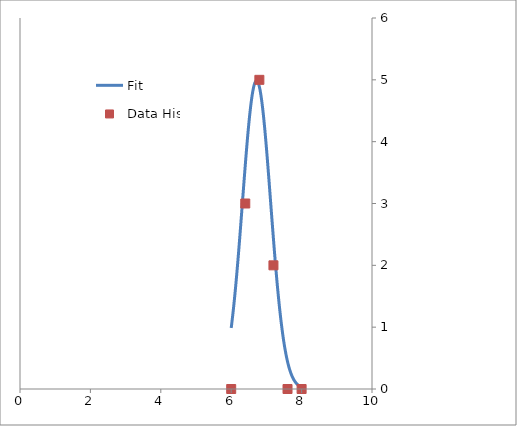
| Category | Fit |
|---|---|
| 6.0 | 0.197 |
| 6.01 | 0.206 |
| 6.02 | 0.216 |
| 6.029999999999999 | 0.225 |
| 6.039999999999999 | 0.235 |
| 6.049999999999999 | 0.245 |
| 6.059999999999999 | 0.256 |
| 6.0699999999999985 | 0.266 |
| 6.079999999999998 | 0.277 |
| 6.089999999999998 | 0.289 |
| 6.099999999999998 | 0.3 |
| 6.109999999999998 | 0.312 |
| 6.119999999999997 | 0.324 |
| 6.129999999999997 | 0.336 |
| 6.139999999999997 | 0.349 |
| 6.149999999999997 | 0.361 |
| 6.159999999999997 | 0.374 |
| 6.169999999999996 | 0.388 |
| 6.179999999999996 | 0.401 |
| 6.189999999999996 | 0.415 |
| 6.199999999999996 | 0.428 |
| 6.2099999999999955 | 0.442 |
| 6.219999999999995 | 0.457 |
| 6.229999999999995 | 0.471 |
| 6.239999999999995 | 0.485 |
| 6.249999999999995 | 0.5 |
| 6.2599999999999945 | 0.515 |
| 6.269999999999994 | 0.53 |
| 6.279999999999994 | 0.545 |
| 6.289999999999994 | 0.56 |
| 6.299999999999994 | 0.575 |
| 6.309999999999993 | 0.59 |
| 6.319999999999993 | 0.605 |
| 6.329999999999993 | 0.62 |
| 6.339999999999993 | 0.635 |
| 6.3499999999999925 | 0.65 |
| 6.359999999999992 | 0.665 |
| 6.369999999999992 | 0.68 |
| 6.379999999999992 | 0.695 |
| 6.389999999999992 | 0.71 |
| 6.3999999999999915 | 0.724 |
| 6.409999999999991 | 0.739 |
| 6.419999999999991 | 0.753 |
| 6.429999999999991 | 0.767 |
| 6.439999999999991 | 0.781 |
| 6.44999999999999 | 0.794 |
| 6.45999999999999 | 0.807 |
| 6.46999999999999 | 0.82 |
| 6.47999999999999 | 0.833 |
| 6.4899999999999896 | 0.845 |
| 6.499999999999989 | 0.857 |
| 6.509999999999989 | 0.869 |
| 6.519999999999989 | 0.88 |
| 6.529999999999989 | 0.891 |
| 6.5399999999999885 | 0.901 |
| 6.549999999999988 | 0.911 |
| 6.559999999999988 | 0.921 |
| 6.569999999999988 | 0.93 |
| 6.579999999999988 | 0.938 |
| 6.589999999999987 | 0.946 |
| 6.599999999999987 | 0.953 |
| 6.609999999999987 | 0.96 |
| 6.619999999999987 | 0.967 |
| 6.629999999999987 | 0.972 |
| 6.639999999999986 | 0.978 |
| 6.649999999999986 | 0.982 |
| 6.659999999999986 | 0.986 |
| 6.669999999999986 | 0.99 |
| 6.6799999999999855 | 0.992 |
| 6.689999999999985 | 0.995 |
| 6.699999999999985 | 0.996 |
| 6.709999999999985 | 0.997 |
| 6.719999999999985 | 0.997 |
| 6.729999999999984 | 0.997 |
| 6.739999999999984 | 0.996 |
| 6.749999999999984 | 0.995 |
| 6.759999999999984 | 0.992 |
| 6.769999999999984 | 0.99 |
| 6.779999999999983 | 0.986 |
| 6.789999999999983 | 0.982 |
| 6.799999999999983 | 0.978 |
| 6.809999999999983 | 0.972 |
| 6.8199999999999825 | 0.967 |
| 6.829999999999982 | 0.96 |
| 6.839999999999982 | 0.953 |
| 6.849999999999982 | 0.946 |
| 6.859999999999982 | 0.938 |
| 6.8699999999999815 | 0.93 |
| 6.879999999999981 | 0.921 |
| 6.889999999999981 | 0.911 |
| 6.899999999999981 | 0.901 |
| 6.909999999999981 | 0.891 |
| 6.91999999999998 | 0.88 |
| 6.92999999999998 | 0.869 |
| 6.93999999999998 | 0.857 |
| 6.94999999999998 | 0.845 |
| 6.9599999999999795 | 0.833 |
| 6.969999999999979 | 0.82 |
| 6.979999999999979 | 0.807 |
| 6.989999999999979 | 0.794 |
| 6.999999999999979 | 0.781 |
| 7.0099999999999785 | 0.767 |
| 7.019999999999978 | 0.753 |
| 7.029999999999978 | 0.739 |
| 7.039999999999978 | 0.724 |
| 7.049999999999978 | 0.71 |
| 7.059999999999977 | 0.695 |
| 7.069999999999977 | 0.68 |
| 7.079999999999977 | 0.665 |
| 7.089999999999977 | 0.65 |
| 7.0999999999999766 | 0.635 |
| 7.109999999999976 | 0.62 |
| 7.119999999999976 | 0.605 |
| 7.129999999999976 | 0.59 |
| 7.139999999999976 | 0.575 |
| 7.1499999999999755 | 0.56 |
| 7.159999999999975 | 0.545 |
| 7.169999999999975 | 0.53 |
| 7.179999999999975 | 0.515 |
| 7.189999999999975 | 0.5 |
| 7.199999999999974 | 0.485 |
| 7.209999999999974 | 0.471 |
| 7.219999999999974 | 0.457 |
| 7.229999999999974 | 0.442 |
| 7.239999999999974 | 0.428 |
| 7.249999999999973 | 0.415 |
| 7.259999999999973 | 0.401 |
| 7.269999999999973 | 0.388 |
| 7.279999999999973 | 0.374 |
| 7.2899999999999725 | 0.361 |
| 7.299999999999972 | 0.349 |
| 7.309999999999972 | 0.336 |
| 7.319999999999972 | 0.324 |
| 7.329999999999972 | 0.312 |
| 7.339999999999971 | 0.3 |
| 7.349999999999971 | 0.289 |
| 7.359999999999971 | 0.277 |
| 7.369999999999971 | 0.266 |
| 7.379999999999971 | 0.256 |
| 7.38999999999997 | 0.245 |
| 7.39999999999997 | 0.235 |
| 7.40999999999997 | 0.225 |
| 7.41999999999997 | 0.216 |
| 7.4299999999999695 | 0.206 |
| 7.439999999999969 | 0.197 |
| 7.449999999999969 | 0.189 |
| 7.459999999999969 | 0.18 |
| 7.469999999999969 | 0.172 |
| 7.4799999999999685 | 0.164 |
| 7.489999999999968 | 0.156 |
| 7.499999999999968 | 0.149 |
| 7.509999999999968 | 0.142 |
| 7.519999999999968 | 0.135 |
| 7.529999999999967 | 0.128 |
| 7.539999999999967 | 0.122 |
| 7.549999999999967 | 0.116 |
| 7.559999999999967 | 0.11 |
| 7.5699999999999665 | 0.104 |
| 7.579999999999966 | 0.099 |
| 7.589999999999966 | 0.094 |
| 7.599999999999966 | 0.089 |
| 7.609999999999966 | 0.084 |
| 7.6199999999999655 | 0.079 |
| 7.629999999999965 | 0.075 |
| 7.639999999999965 | 0.071 |
| 7.649999999999965 | 0.067 |
| 7.659999999999965 | 0.063 |
| 7.669999999999964 | 0.059 |
| 7.679999999999964 | 0.056 |
| 7.689999999999964 | 0.053 |
| 7.699999999999964 | 0.05 |
| 7.7099999999999635 | 0.047 |
| 7.719999999999963 | 0.044 |
| 7.729999999999963 | 0.041 |
| 7.739999999999963 | 0.039 |
| 7.749999999999963 | 0.036 |
| 7.7599999999999625 | 0.034 |
| 7.769999999999962 | 0.032 |
| 7.779999999999962 | 0.03 |
| 7.789999999999962 | 0.028 |
| 7.799999999999962 | 0.026 |
| 7.809999999999961 | 0.024 |
| 7.819999999999961 | 0.023 |
| 7.829999999999961 | 0.021 |
| 7.839999999999961 | 0.02 |
| 7.849999999999961 | 0.018 |
| 7.85999999999996 | 0.017 |
| 7.86999999999996 | 0.016 |
| 7.87999999999996 | 0.015 |
| 7.88999999999996 | 0.014 |
| 7.8999999999999595 | 0.013 |
| 7.909999999999959 | 0.012 |
| 7.919999999999959 | 0.011 |
| 7.929999999999959 | 0.01 |
| 7.939999999999959 | 0.01 |
| 7.949999999999958 | 0.009 |
| 7.959999999999958 | 0.008 |
| 7.969999999999958 | 0.008 |
| 7.979999999999958 | 0.007 |
| 7.989999999999958 | 0.006 |
| 7.999999999999957 | 0.006 |